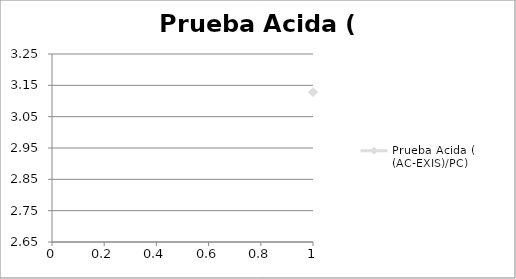
| Category | Prueba Acida ( (AC-EXIS)/PC) |
|---|---|
| 0 | 3.128 |
| 1 | 2.976 |
| 2 | 2.99 |
| 3 | 2.824 |
| 4 | 2.903 |
| 5 | 2.914 |
| 6 | 2.84 |
| 7 | 2.718 |